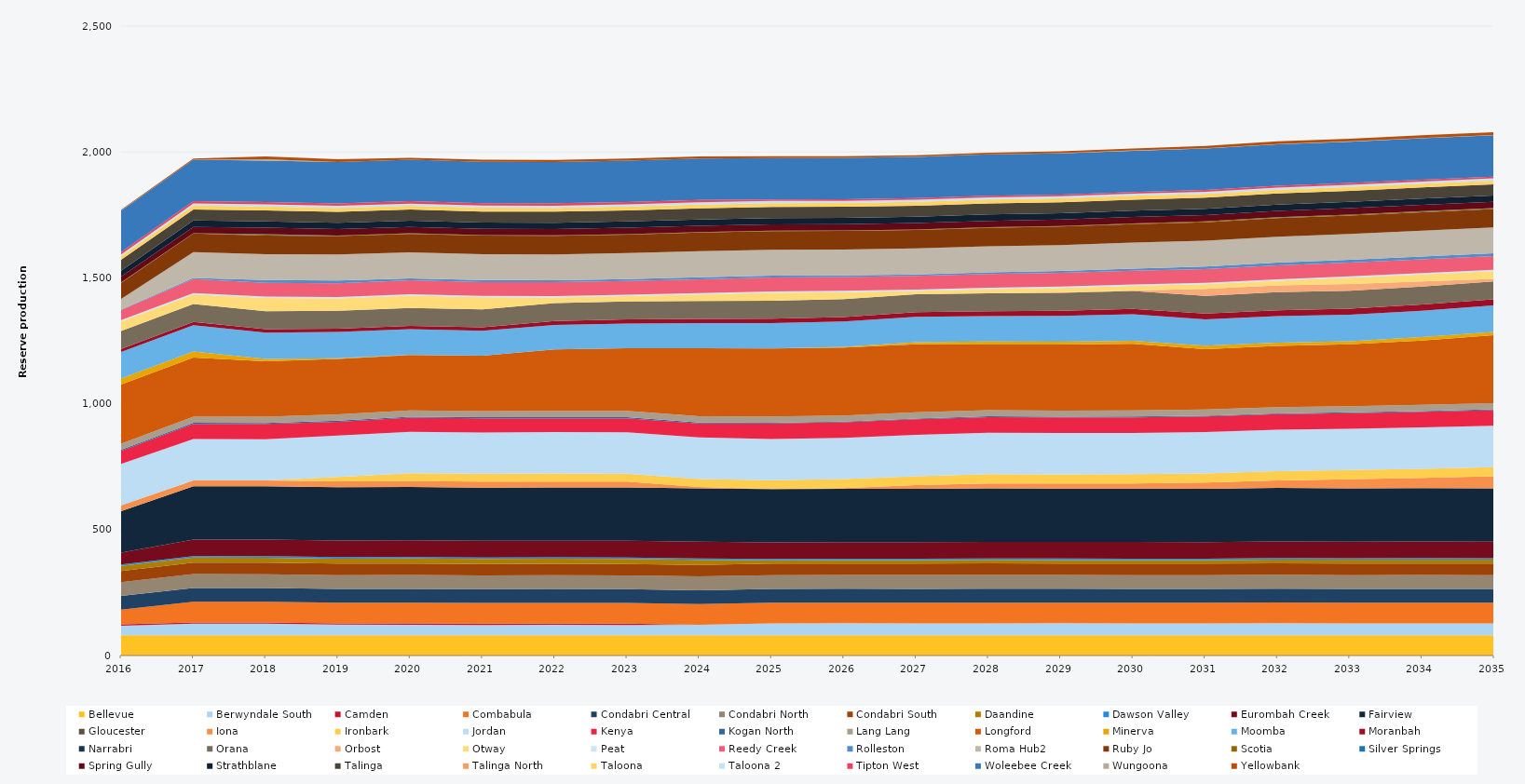
| Category | Bellevue | Berwyndale South | Camden | Combabula | Condabri Central | Condabri North | Condabri South | Daandine | Dawson Valley | Eurombah Creek | Fairview | Gloucester | Iona | Ironbark | Jordan | Kenya | Kogan North | Lang Lang | Longford | Minerva | Moomba | Moranbah | Narrabri | Orana | Orbost | Otway | Peat | Reedy Creek | Rolleston | Roma Hub2 | Ruby Jo | Scotia | Silver Springs | Spring Gully | Strathblane | Talinga | Talinga North | Taloona | Taloona 2 | Tipton West | Woleebee Creek | Wungoona | Yellowbank |
|---|---|---|---|---|---|---|---|---|---|---|---|---|---|---|---|---|---|---|---|---|---|---|---|---|---|---|---|---|---|---|---|---|---|---|---|---|---|---|---|---|---|---|---|
| 2016 | 80.52 | 38.218 | 5 | 58.507 | 54.312 | 54.398 | 44.781 | 20.13 | 5.856 | 46.802 | 164.753 | 0 | 23.12 | 0 | 164.7 | 51.373 | 4.392 | 24.522 | 235.041 | 23.79 | 105 | 12.867 | 0 | 70.817 | 0 | 38 | 5.49 | 39.208 | 2.047 | 42.998 | 64.014 | 1.196 | 0.559 | 22.621 | 22.913 | 43.429 | 0 | 13.846 | 7.474 | 9.516 | 164.7 | 1.231 | 2.142 |
| 2017 | 80.3 | 46.399 | 5 | 82.125 | 54.75 | 54.75 | 45.625 | 20.075 | 5.84 | 65.7 | 211.7 | 0 | 23.12 | 0 | 164.25 | 60.564 | 4.38 | 24.455 | 234.628 | 23.725 | 105 | 12.873 | 0 | 71.175 | 0 | 38 | 5.475 | 54.75 | 4.655 | 102.93 | 73.702 | 1.083 | 0.272 | 25.185 | 25.185 | 43.8 | 0 | 15.33 | 8.395 | 9.49 | 164.25 | 0.614 | 4.064 |
| 2018 | 80.3 | 46.007 | 5 | 82.125 | 54.75 | 54.75 | 45.625 | 20.075 | 5.84 | 65.7 | 211.7 | 0 | 23.12 | 0 | 164.25 | 60.332 | 4.38 | 24.455 | 220 | 9.373 | 105 | 13.04 | 0 | 71.175 | 0 | 53.424 | 5.475 | 54.75 | 10.807 | 102.93 | 73.702 | 3.256 | 2.433 | 25.185 | 25.185 | 43.8 | 0 | 15.33 | 8.395 | 9.49 | 164.25 | 5.902 | 10.859 |
| 2019 | 80.3 | 42.302 | 5 | 82.125 | 54.75 | 54.75 | 45.625 | 20.075 | 5.84 | 65.7 | 211.7 | 0 | 23.12 | 18.25 | 164.25 | 54.871 | 4.38 | 24.455 | 220 | 3.025 | 105 | 12.81 | 0 | 71.175 | 0 | 48.95 | 5.475 | 54.75 | 10.947 | 102.93 | 73.702 | 1.963 | 0.104 | 25.185 | 25.185 | 43.8 | 0 | 15.33 | 8.395 | 9.49 | 164.25 | 0.318 | 10.949 |
| 2020 | 80.52 | 41.969 | 5 | 82.35 | 54.9 | 54.9 | 45.75 | 20.13 | 5.856 | 65.88 | 212.28 | 0 | 23.12 | 31.573 | 164.7 | 55.641 | 4.392 | 24.522 | 220 | 0.837 | 102.21 | 12.781 | 0 | 71.37 | 0 | 48.95 | 5.49 | 54.9 | 7.717 | 103.212 | 73.873 | 1.887 | 0 | 25.254 | 25.254 | 43.92 | 0 | 15.372 | 8.418 | 9.516 | 164.7 | 0 | 7.515 |
| 2021 | 80.3 | 41.202 | 5 | 82.125 | 54.75 | 54.75 | 45.625 | 20.075 | 5.84 | 65.7 | 211.7 | 0 | 23.12 | 31.496 | 164.25 | 56.425 | 4.38 | 24.455 | 220 | 0 | 98.743 | 13.533 | 0 | 71.175 | 0 | 47.94 | 5.475 | 54.75 | 8.071 | 102.93 | 73.674 | 1.892 | 0.016 | 25.185 | 25.185 | 43.8 | 0 | 15.33 | 8.395 | 9.49 | 164.25 | 0.014 | 8.438 |
| 2022 | 80.3 | 41.806 | 5 | 82.125 | 54.75 | 54.75 | 45.625 | 20.075 | 5.84 | 65.7 | 211.7 | 0 | 23.12 | 32.138 | 164.25 | 55.37 | 4.38 | 24.455 | 244.607 | 0 | 97.216 | 15.298 | 0 | 71.175 | 0 | 22.645 | 5.475 | 54.75 | 7.665 | 102.93 | 73.63 | 1.83 | 0.012 | 25.185 | 25.185 | 43.8 | 0 | 15.33 | 8.395 | 9.49 | 164.25 | 0.03 | 7.795 |
| 2023 | 80.3 | 41.214 | 5 | 82.125 | 54.75 | 54.75 | 45.625 | 20.075 | 5.84 | 65.7 | 211.7 | 0 | 23.12 | 32.092 | 164.25 | 55.987 | 4.38 | 24.455 | 249.161 | 0 | 98.292 | 16.264 | 0 | 71.175 | 0 | 20.87 | 5.475 | 54.75 | 7.947 | 102.93 | 73.586 | 1.995 | 0.012 | 25.185 | 25.185 | 43.8 | 0 | 15.33 | 8.395 | 9.49 | 164.25 | 0.03 | 8.047 |
| 2024 | 80.52 | 41.484 | 0 | 82.35 | 54.9 | 54.9 | 45.75 | 20.13 | 5.856 | 65.88 | 212.28 | 0 | 5.3 | 31.833 | 164.7 | 55.474 | 4.392 | 24.522 | 270 | 0 | 100.02 | 16.79 | 0 | 71.37 | 0 | 25.634 | 5.49 | 54.9 | 8.2 | 103.212 | 73.713 | 1.867 | 0.024 | 25.254 | 25.254 | 43.92 | 0 | 15.372 | 8.418 | 9.516 | 164.7 | 0.066 | 8.173 |
| 2025 | 80.3 | 47.459 | 0 | 82.125 | 54.75 | 54.75 | 45.625 | 13.017 | 5.84 | 65.7 | 211.7 | 0 | 0 | 34.554 | 164.25 | 62.037 | 2.816 | 24.455 | 270 | 0 | 101.039 | 17.268 | 0 | 71.175 | 0 | 32.023 | 5.475 | 54.75 | 7.524 | 102.93 | 73.498 | 2.165 | 0.081 | 25.185 | 25.185 | 43.8 | 0 | 15.33 | 8.395 | 6.203 | 164.25 | 0.19 | 7.448 |
| 2026 | 80.3 | 47.818 | 0 | 82.125 | 54.75 | 54.75 | 45.625 | 13.728 | 5.84 | 65.7 | 211.7 | 0 | 2.705 | 35.404 | 164.25 | 61.68 | 2.791 | 24.455 | 270 | 2.672 | 100.577 | 17.518 | 0 | 71.175 | 0.185 | 27.638 | 5.475 | 54.75 | 6.047 | 102.93 | 73.455 | 2.063 | 0.096 | 25.185 | 25.185 | 43.8 | 0 | 15.33 | 8.395 | 6.322 | 164.25 | 0.217 | 6.035 |
| 2027 | 80.3 | 47.513 | 0 | 82.125 | 54.75 | 54.75 | 45.625 | 13.977 | 5.84 | 65.7 | 211.7 | 0 | 14.075 | 36.016 | 164.25 | 61.97 | 2.822 | 24.455 | 270 | 8.902 | 100.606 | 18.14 | 0 | 71.175 | 0.225 | 12.612 | 5.475 | 54.75 | 5.965 | 102.93 | 73.411 | 2.224 | 0.088 | 25.185 | 25.185 | 43.8 | 0 | 15.33 | 8.395 | 6.332 | 164.25 | 0.191 | 6.174 |
| 2028 | 80.52 | 47.423 | 0 | 82.35 | 54.9 | 54.9 | 45.75 | 13.942 | 5.856 | 65.88 | 212.28 | 0 | 19.721 | 36.6 | 164.7 | 62.354 | 3.109 | 24.522 | 260.611 | 11.878 | 100.844 | 18.99 | 0 | 71.37 | 0.21 | 16.399 | 5.49 | 54.9 | 6.369 | 103.212 | 73.537 | 2.336 | 0.197 | 25.254 | 25.254 | 43.92 | 0 | 15.372 | 8.418 | 6.419 | 164.7 | 0.443 | 6.245 |
| 2029 | 80.3 | 47.82 | 0 | 82.125 | 54.75 | 54.75 | 45.625 | 14.08 | 5.84 | 65.7 | 211.7 | 0 | 20.526 | 36.5 | 164.25 | 61.679 | 2.995 | 24.455 | 262.304 | 10.917 | 103.011 | 20.344 | 0 | 71.175 | 1.542 | 17.287 | 5.475 | 54.75 | 7.447 | 102.93 | 73.323 | 2.267 | 0.319 | 25.185 | 25.185 | 43.8 | 0 | 15.33 | 8.395 | 6.278 | 164.25 | 0.737 | 7.272 |
| 2030 | 80.3 | 47.44 | 0 | 82.125 | 54.75 | 54.75 | 45.625 | 14.233 | 5.84 | 65.7 | 211.7 | 0 | 21.007 | 36.5 | 164.25 | 62.06 | 2.946 | 24.455 | 264.048 | 12.385 | 105 | 21.608 | 0 | 71.175 | 1.592 | 18.888 | 5.475 | 54.75 | 8.432 | 102.93 | 73.279 | 2.649 | 0.435 | 25.185 | 25.185 | 43.8 | 0 | 15.33 | 8.395 | 6.422 | 164.25 | 0.991 | 8.09 |
| 2031 | 80.3 | 47.28 | 0 | 82.125 | 54.75 | 54.75 | 45.625 | 14.211 | 5.84 | 65.7 | 211.7 | 0 | 24.401 | 36.5 | 164.25 | 62.215 | 3.033 | 24.455 | 239.416 | 13.608 | 105 | 22.555 | 0 | 71.175 | 27.375 | 18.525 | 5.475 | 54.75 | 9.767 | 102.93 | 73.235 | 2.929 | 0.367 | 25.185 | 25.185 | 43.8 | 0 | 15.33 | 8.395 | 6.933 | 164.25 | 1.082 | 9.384 |
| 2032 | 80.52 | 47.72 | 0 | 82.35 | 54.9 | 54.9 | 45.75 | 15.129 | 5.856 | 65.88 | 212.28 | 0 | 29.936 | 36.6 | 164.7 | 62.069 | 3.174 | 24.522 | 242.918 | 13.833 | 105 | 23.473 | 0 | 71.37 | 27.45 | 18.526 | 5.49 | 54.9 | 10.98 | 103.212 | 73.361 | 3.195 | 0.525 | 25.254 | 25.254 | 43.92 | 0 | 15.372 | 8.418 | 6.967 | 164.7 | 1.23 | 10.98 |
| 2033 | 80.3 | 47.418 | 0 | 82.125 | 54.75 | 54.75 | 45.625 | 15.951 | 5.84 | 65.7 | 211.7 | 0 | 35.944 | 36.5 | 164.25 | 62.07 | 3.233 | 24.455 | 245.205 | 12.62 | 105 | 23.984 | 0 | 71.175 | 27.375 | 24.802 | 5.475 | 54.75 | 10.305 | 102.93 | 73.147 | 3.525 | 0.622 | 25.185 | 25.185 | 43.8 | 0 | 15.33 | 8.395 | 7.108 | 164.25 | 1.505 | 10.243 |
| 2034 | 80.3 | 47.61 | 0 | 82.125 | 54.75 | 54.75 | 45.625 | 15.959 | 5.84 | 65.7 | 211.7 | 0 | 40.689 | 36.5 | 164.25 | 61.88 | 3.335 | 24.455 | 255.21 | 13.87 | 105 | 24.559 | 0 | 71.175 | 20.902 | 27.215 | 5.475 | 54.75 | 10.842 | 102.93 | 73.103 | 3.708 | 0.598 | 25.185 | 25.185 | 43.8 | 0 | 15.33 | 8.395 | 7.184 | 164.25 | 1.534 | 10.845 |
| 2035 | 80.3 | 47.26 | 0 | 82.125 | 54.75 | 54.75 | 45.625 | 16.15 | 5.84 | 65.7 | 211.7 | 0 | 47.39 | 36.5 | 164.25 | 62.24 | 3.332 | 24.455 | 269.884 | 13.117 | 105 | 24.812 | 0 | 71.175 | 10.065 | 30.053 | 5.475 | 54.75 | 10.95 | 102.93 | 72.753 | 3.192 | 0.627 | 25.185 | 25.185 | 43.8 | 0 | 15.33 | 8.395 | 6.911 | 164.25 | 1.468 | 10.95 |